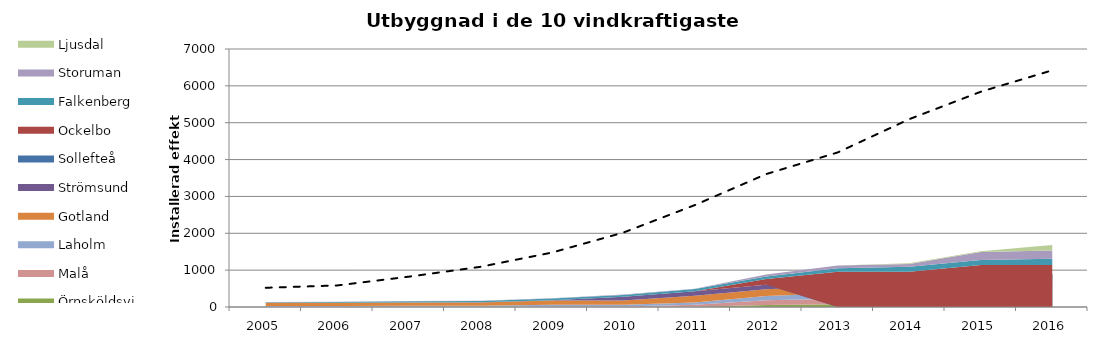
| Category | Hela landet |
|---|---|
| 2005 | 521.505 |
| 2006 | 585.12 |
| 2007 | 822.44 |
| 2008 | 1089.693 |
| 2009 | 1475.514 |
| 2010 | 2017.84 |
| 2011 | 2764.511 |
| 2012 | 3606.773 |
| 2013 | 4193.845 |
| 2014 | 5096.542 |
| 2015 | 5840.294 |
| 2016 | 6422 |